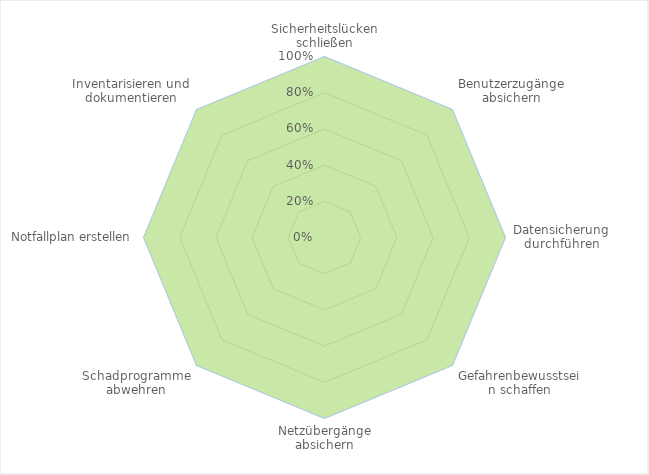
| Category | Series 0 |
|---|---|
| Sicherheitslücken schließen | 1 |
| Benutzerzugänge absichern | 1 |
| Datensicherung durchführen | 1 |
| Gefahrenbewusstsein schaffen | 1 |
| Netzübergänge absichern | 1 |
| Schadprogramme abwehren | 1 |
| Notfallplan erstellen | 1 |
| Inventarisieren und dokumentieren | 1 |